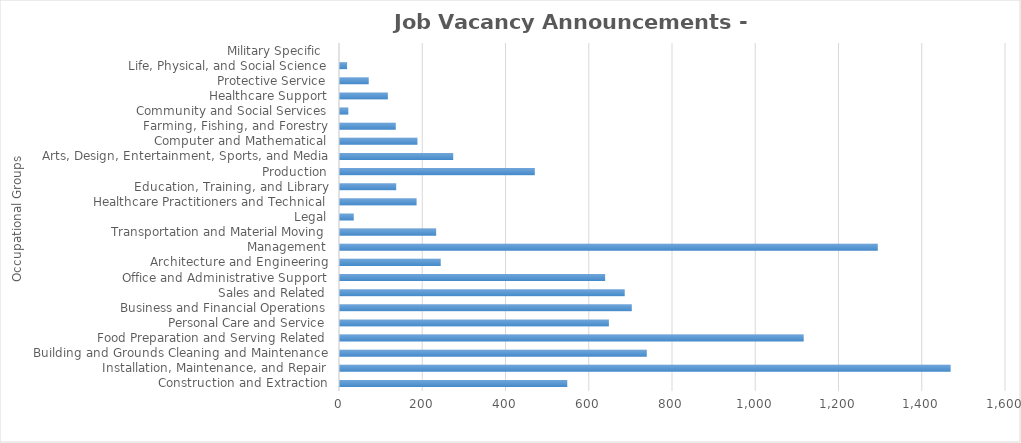
| Category | Total JVAs |
|---|---|
| Construction and Extraction | 546 |
| Installation, Maintenance, and Repair | 1467 |
| Building and Grounds Cleaning and Maintenance | 737 |
| Food Preparation and Serving Related | 1114 |
| Personal Care and Service | 646 |
| Business and Financial Operations | 701 |
| Sales and Related | 684 |
| Office and Administrative Support | 637 |
| Architecture and Engineering | 242 |
| Management | 1292 |
| Transportation and Material Moving | 231 |
| Legal | 33 |
| Healthcare Practitioners and Technical | 184 |
| Education, Training, and Library | 135 |
| Production | 468 |
| Arts, Design, Entertainment, Sports, and Media | 272 |
| Computer and Mathematical | 186 |
| Farming, Fishing, and Forestry | 134 |
| Community and Social Services | 20 |
| Healthcare Support | 115 |
| Protective Service | 69 |
| Life, Physical, and Social Science | 17 |
| Military Specific  | 0 |